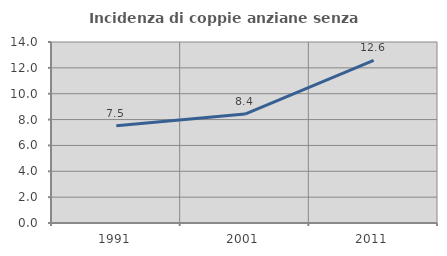
| Category | Incidenza di coppie anziane senza figli  |
|---|---|
| 1991.0 | 7.515 |
| 2001.0 | 8.428 |
| 2011.0 | 12.582 |